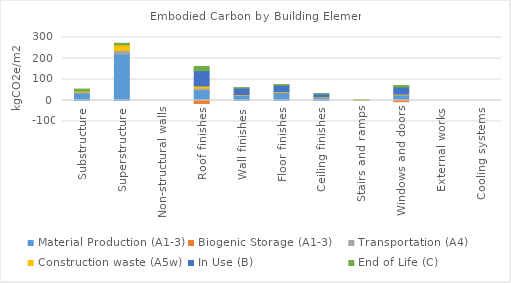
| Category | Material Production (A1-3) | Biogenic Storage (A1-3) | Transportation (A4) | Construction waste (A5w) | In Use (B) | End of Life (C) |
|---|---|---|---|---|---|---|
| Substructure | 35.593 | 0 | 5.455 | 4.206 | 0 | 8.996 |
| Superstructure | 221.024 | 0 | 17.406 | 26.273 | 0 | 7.693 |
| Non-structural walls | 0 | 0 | 0 | 0 | 0 | 0 |
| Roof finishes | 50.619 | -14.054 | 7.995 | 10.51 | 73.205 | 19.825 |
| Wall finishes | 24.142 | 0 | 2.405 | 1.974 | 30.48 | 1.96 |
| Floor finishes | 36.904 | 0 | 2.149 | 3.281 | 30.402 | 2.839 |
| Ceiling finishes | 12.566 | 0 | 4.311 | 1.503 | 13.045 | 0.337 |
| Stairs and ramps | 2.292 | 0 | 0.08 | 0.147 | 0 | 0.121 |
| Windows and doors | 24.854 | -5.385 | 4.167 | 1.937 | 32.922 | 7.349 |
| External works | 0 | 0 | 0 | 0 | 0 | 0 |
| Cooling systems | 0 | 0 | 0 | 0 | 0 | 0 |